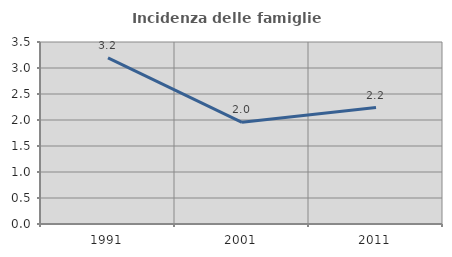
| Category | Incidenza delle famiglie numerose |
|---|---|
| 1991.0 | 3.193 |
| 2001.0 | 1.955 |
| 2011.0 | 2.24 |